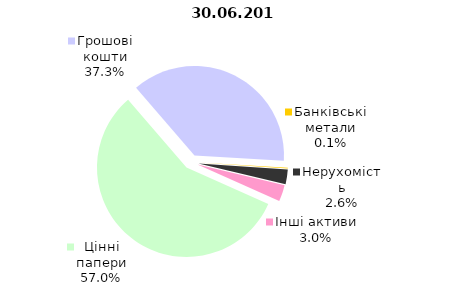
| Category | 30.06.2019 |
|---|---|
| Цінні папери | 1649.3 |
| Грошові кошти | 1077.9 |
| Банківські метали | 4.2 |
| Нерухомість | 76.1 |
| Інші активи | 85.4 |